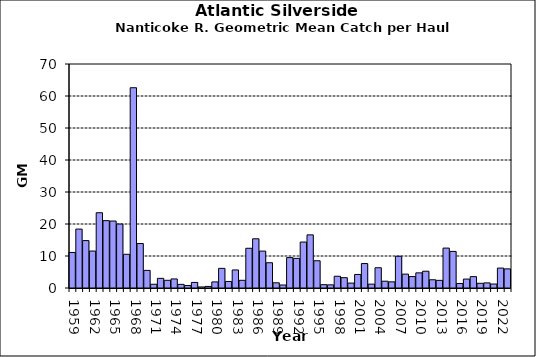
| Category | Series 0 |
|---|---|
| 1959.0 | 11.104 |
| 1960.0 | 18.411 |
| 1961.0 | 14.818 |
| 1962.0 | 11.551 |
| 1963.0 | 23.523 |
| 1964.0 | 21.045 |
| 1965.0 | 20.925 |
| 1966.0 | 19.982 |
| 1967.0 | 10.534 |
| 1968.0 | 62.585 |
| 1969.0 | 13.896 |
| 1970.0 | 5.506 |
| 1971.0 | 1.17 |
| 1972.0 | 3.019 |
| 1973.0 | 2.403 |
| 1974.0 | 2.829 |
| 1975.0 | 1.134 |
| 1976.0 | 0.787 |
| 1977.0 | 1.742 |
| 1978.0 | 0.331 |
| 1979.0 | 0.496 |
| 1980.0 | 1.903 |
| 1981.0 | 6.137 |
| 1982.0 | 2.045 |
| 1983.0 | 5.639 |
| 1984.0 | 2.404 |
| 1985.0 | 12.414 |
| 1986.0 | 15.381 |
| 1987.0 | 11.534 |
| 1988.0 | 7.896 |
| 1989.0 | 1.624 |
| 1990.0 | 0.933 |
| 1991.0 | 9.502 |
| 1992.0 | 9.266 |
| 1993.0 | 14.363 |
| 1994.0 | 16.603 |
| 1995.0 | 8.514 |
| 1996.0 | 1.037 |
| 1997.0 | 0.984 |
| 1998.0 | 3.673 |
| 1999.0 | 3.226 |
| 2000.0 | 1.536 |
| 2001.0 | 4.229 |
| 2002.0 | 7.638 |
| 2003.0 | 1.21 |
| 2004.0 | 6.33 |
| 2005.0 | 2.124 |
| 2006.0 | 1.92 |
| 2007.0 | 9.912 |
| 2008.0 | 4.341 |
| 2009.0 | 3.571 |
| 2010.0 | 4.736 |
| 2011.0 | 5.242 |
| 2012.0 | 2.574 |
| 2013.0 | 2.39 |
| 2014.0 | 12.471 |
| 2015.0 | 11.434 |
| 2016.0 | 1.407 |
| 2017.0 | 2.785 |
| 2018.0 | 3.554 |
| 2019.0 | 1.47 |
| 2020.0 | 1.6 |
| 2021.0 | 1.242 |
| 2022.0 | 6.226 |
| 2023.0 | 5.972 |